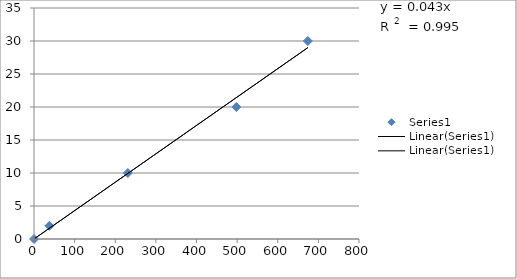
| Category | Series 0 |
|---|---|
| 0.0 | 0 |
| 38.0 | 2 |
| 231.0 | 10 |
| 498.0 | 20 |
| 674.0 | 30 |